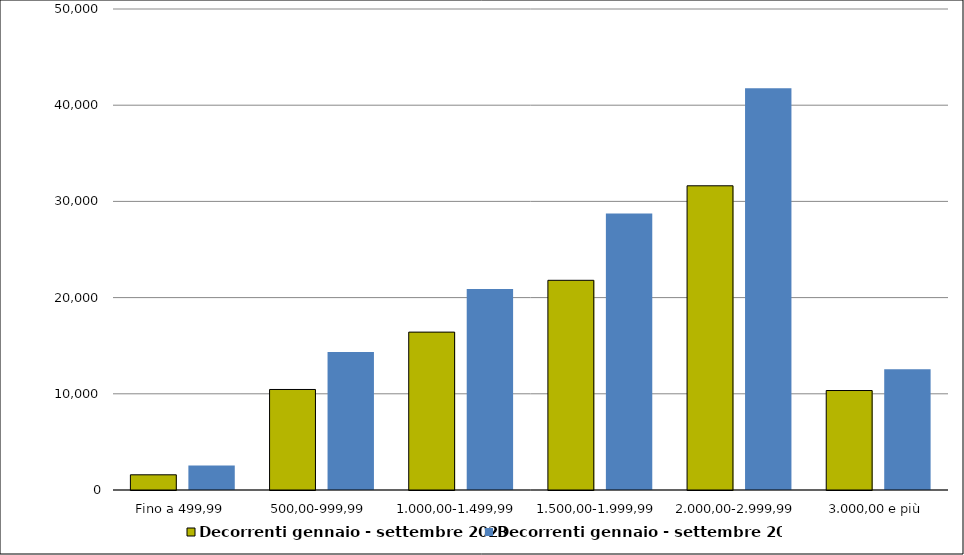
| Category | Decorrenti gennaio - settembre 2023 | Decorrenti gennaio - settembre 2022 |
|---|---|---|
|  Fino a 499,99  | 1580 | 2540 |
|  500,00-999,99  | 10450 | 14352 |
|  1.000,00-1.499,99  | 16412 | 20886 |
|  1.500,00-1.999,99  | 21798 | 28743 |
|  2.000,00-2.999,99  | 31622 | 41759 |
|  3.000,00 e più  | 10340 | 12562 |